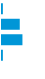
| Category | Series 0 |
|---|---|
| 0 | 0.022 |
| 1 | 0.444 |
| 2 | 0.511 |
| 3 | 0.022 |